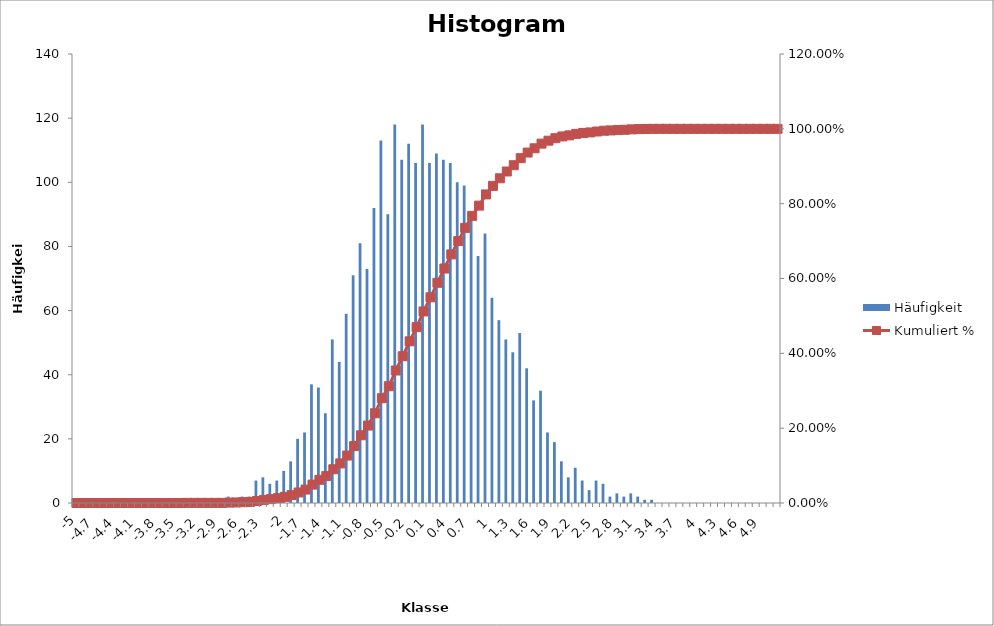
| Category | Häufigkeit |
|---|---|
| -5 | 0 |
| -4,9 | 0 |
| -4,8 | 0 |
| -4,7 | 0 |
| -4,6 | 0 |
| -4,5 | 0 |
| -4,4 | 0 |
| -4,3 | 0 |
| -4,2 | 0 |
| -4,1 | 0 |
| -4 | 0 |
| -3,9 | 0 |
| -3,8 | 0 |
| -3,7 | 0 |
| -3,6 | 0 |
| -3,5 | 0 |
| -3,4 | 1 |
| -3,3 | 0 |
| -3,2 | 0 |
| -3,1 | 0 |
| -3 | 0 |
| -2,9 | 0 |
| -2,8 | 2 |
| -2,7 | 1 |
| -2,6 | 2 |
| -2,5 | 2 |
| -2,4 | 7 |
| -2,3 | 8 |
| -2,2 | 6 |
| -2,1 | 7 |
| -2 | 10 |
| -1,9 | 13 |
| -1,8 | 20 |
| -1,7 | 22 |
| -1,6 | 37 |
| -1,5 | 36 |
| -1,4 | 28 |
| -1,3 | 51 |
| -1,2 | 44 |
| -1,1 | 59 |
| -1 | 71 |
| -0,9 | 81 |
| -0,8 | 73 |
| -0,7 | 92 |
| -0,6 | 113 |
| -0,5 | 90 |
| -0,4 | 118 |
| -0,3 | 107 |
| -0,2 | 112 |
| -0,1 | 106 |
| -1,02696E-15 | 118 |
| 0,1 | 106 |
| 0,2 | 109 |
| 0,3 | 107 |
| 0,4 | 106 |
| 0,5 | 100 |
| 0,6 | 99 |
| 0,7 | 90 |
| 0,8 | 77 |
| 0,9 | 84 |
| 1 | 64 |
| 1,1 | 57 |
| 1,2 | 51 |
| 1,3 | 47 |
| 1,4 | 53 |
| 1,5 | 42 |
| 1,6 | 32 |
| 1,7 | 35 |
| 1,8 | 22 |
| 1,9 | 19 |
| 2 | 13 |
| 2,1 | 8 |
| 2,2 | 11 |
| 2,3 | 7 |
| 2,4 | 4 |
| 2,5 | 7 |
| 2,6 | 6 |
| 2,7 | 2 |
| 2,8 | 3 |
| 2,9 | 2 |
| 3 | 3 |
| 3,1 | 2 |
| 3,2 | 1 |
| 3,3 | 1 |
| 3,4 | 0 |
| 3,5 | 0 |
| 3,6 | 0 |
| 3,7 | 0 |
| 3,8 | 0 |
| 3,9 | 0 |
| 4 | 0 |
| 4,1 | 0 |
| 4,2 | 0 |
| 4,3 | 0 |
| 4,4 | 0 |
| 4,5 | 0 |
| 4,6 | 0 |
| 4,7 | 0 |
| 4,8 | 0 |
| 4,9 | 0 |
| 5 | 0 |
| und größer | 0 |